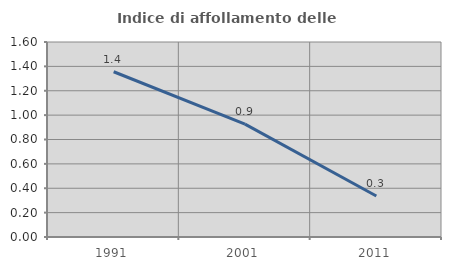
| Category | Indice di affollamento delle abitazioni  |
|---|---|
| 1991.0 | 1.356 |
| 2001.0 | 0.926 |
| 2011.0 | 0.337 |